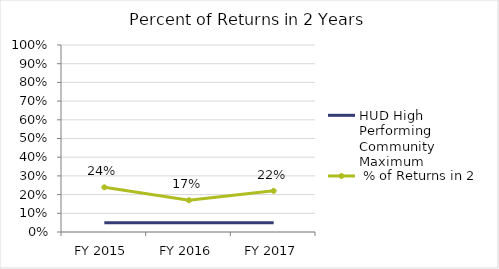
| Category | HUD High Performing Community Maximum |  % of Returns in 2 Years |
|---|---|---|
| FY 2015 | 0.05 | 0.239 |
| FY 2016 | 0.05 | 0.17 |
| FY 2017 | 0.05 | 0.22 |